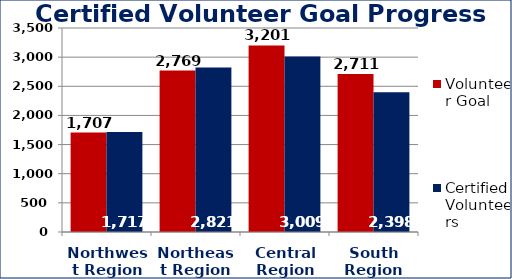
| Category | Volunteer Goal  | Certified Volunteers  |
|---|---|---|
| Northwest Region | 1707 | 1717 |
| Northeast Region | 2769 | 2821 |
| Central Region | 3201 | 3009 |
| South Region | 2711 | 2398 |